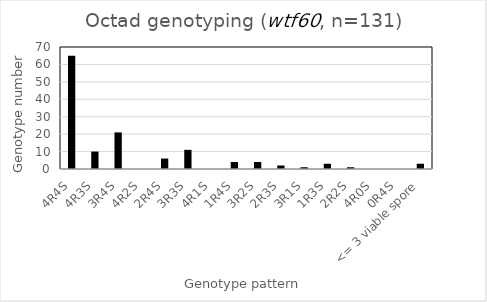
| Category | Number |
|---|---|
| 4R4S | 65 |
| 4R3S | 10 |
| 3R4S | 21 |
| 4R2S | 0 |
| 2R4S | 6 |
| 3R3S | 11 |
| 4R1S | 0 |
| 1R4S | 4 |
| 3R2S | 4 |
| 2R3S | 2 |
| 3R1S | 1 |
| 1R3S | 3 |
| 2R2S | 1 |
| 4R0S | 0 |
| 0R4S | 0 |
| <= 3 viable spore | 3 |